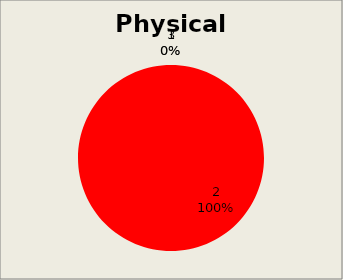
| Category | Series 0 |
|---|---|
| 0 | 0 |
| 1 | 7 |
| 2 | 0 |